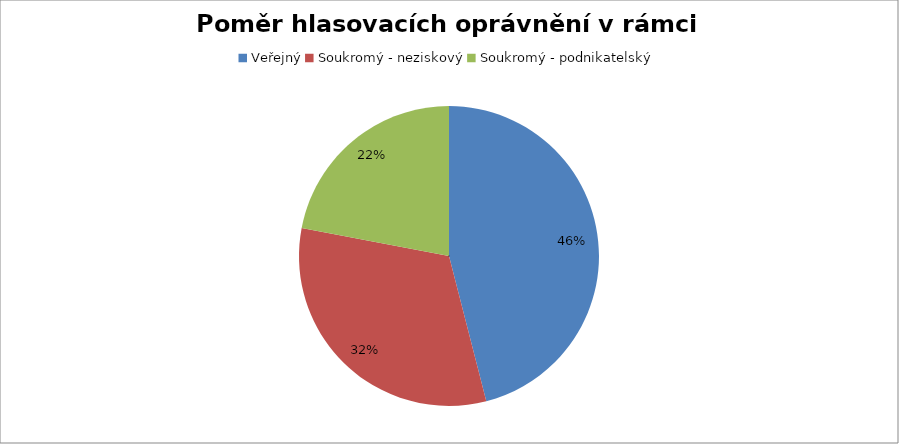
| Category | Series 0 |
|---|---|
| Veřejný | 0.46 |
| Soukromý - neziskový | 0.32 |
| Soukromý - podnikatelský | 0.22 |